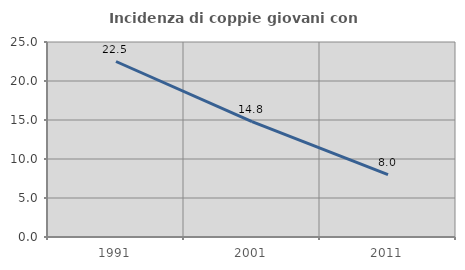
| Category | Incidenza di coppie giovani con figli |
|---|---|
| 1991.0 | 22.5 |
| 2001.0 | 14.793 |
| 2011.0 | 8 |